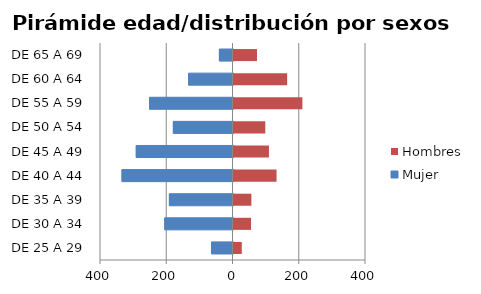
| Category | Mujer | Hombres |
|---|---|---|
| DE 25 A 29 | -65 | 25 |
| DE 30 A 34 | -206 | 53 |
| DE 35 A 39 | -192 | 54 |
| DE 40 A 44 | -335 | 130 |
| DE 45 A 49 | -292 | 107 |
| DE 50 A 54 | -180 | 96 |
| DE 55 A 59 | -252 | 208 |
| DE 60 A 64 | -134 | 162 |
| DE 65 A 69 | -41 | 71 |